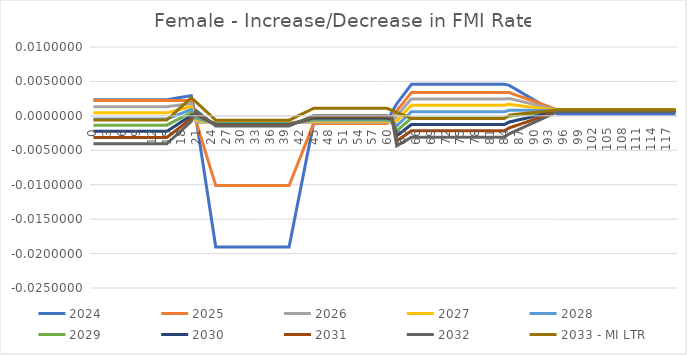
| Category | 2024 | 2025 | 2026 | 2027 | 2028 | 2029 | 2030 | 2031 | 2032 | 2033 - MI LTR |
|---|---|---|---|---|---|---|---|---|---|---|
| 0.0 | 0.002 | 0.002 | 0.001 | 0 | 0 | -0.001 | -0.002 | -0.003 | -0.004 | -0.001 |
| 1.0 | 0.002 | 0.002 | 0.001 | 0 | 0 | -0.001 | -0.002 | -0.003 | -0.004 | -0.001 |
| 2.0 | 0.002 | 0.002 | 0.001 | 0 | 0 | -0.001 | -0.002 | -0.003 | -0.004 | -0.001 |
| 3.0 | 0.002 | 0.002 | 0.001 | 0 | 0 | -0.001 | -0.002 | -0.003 | -0.004 | -0.001 |
| 4.0 | 0.002 | 0.002 | 0.001 | 0 | 0 | -0.001 | -0.002 | -0.003 | -0.004 | -0.001 |
| 5.0 | 0.002 | 0.002 | 0.001 | 0 | 0 | -0.001 | -0.002 | -0.003 | -0.004 | -0.001 |
| 6.0 | 0.002 | 0.002 | 0.001 | 0 | 0 | -0.001 | -0.002 | -0.003 | -0.004 | -0.001 |
| 7.0 | 0.002 | 0.002 | 0.001 | 0 | 0 | -0.001 | -0.002 | -0.003 | -0.004 | -0.001 |
| 8.0 | 0.002 | 0.002 | 0.001 | 0 | 0 | -0.001 | -0.002 | -0.003 | -0.004 | -0.001 |
| 9.0 | 0.002 | 0.002 | 0.001 | 0 | 0 | -0.001 | -0.002 | -0.003 | -0.004 | -0.001 |
| 10.0 | 0.002 | 0.002 | 0.001 | 0 | 0 | -0.001 | -0.002 | -0.003 | -0.004 | -0.001 |
| 11.0 | 0.002 | 0.002 | 0.001 | 0 | 0 | -0.001 | -0.002 | -0.003 | -0.004 | -0.001 |
| 12.0 | 0.002 | 0.002 | 0.001 | 0 | 0 | -0.001 | -0.002 | -0.003 | -0.004 | -0.001 |
| 13.0 | 0.002 | 0.002 | 0.001 | 0 | 0 | -0.001 | -0.002 | -0.003 | -0.004 | -0.001 |
| 14.0 | 0.002 | 0.002 | 0.001 | 0 | 0 | -0.001 | -0.002 | -0.003 | -0.004 | -0.001 |
| 15.0 | 0.002 | 0.002 | 0.001 | 0 | 0 | -0.001 | -0.002 | -0.003 | -0.004 | -0.001 |
| 16.0 | 0.002 | 0.002 | 0.001 | 0.001 | 0 | -0.001 | -0.002 | -0.003 | -0.003 | 0 |
| 17.0 | 0.003 | 0.002 | 0.002 | 0.001 | 0 | -0.001 | -0.001 | -0.002 | -0.003 | 0.001 |
| 18.0 | 0.003 | 0.002 | 0.002 | 0.001 | 0 | 0 | -0.001 | -0.001 | -0.002 | 0.001 |
| 19.0 | 0.003 | 0.002 | 0.002 | 0.001 | 0.001 | 0 | 0 | -0.001 | -0.001 | 0.002 |
| 20.0 | 0.003 | 0.002 | 0.002 | 0.001 | 0.001 | 0 | 0 | 0 | -0.001 | 0.003 |
| 21.0 | -0.001 | -0.001 | -0.001 | -0.001 | 0 | 0 | 0 | 0 | 0.001 | 0.002 |
| 22.0 | -0.005 | -0.003 | -0.001 | -0.001 | -0.001 | 0 | 0 | 0 | 0 | 0.001 |
| 23.0 | -0.01 | -0.005 | -0.001 | -0.001 | -0.001 | -0.001 | -0.001 | 0 | 0 | 0.001 |
| 24.0 | -0.014 | -0.008 | -0.001 | -0.001 | -0.001 | -0.001 | -0.001 | -0.001 | -0.001 | 0 |
| 25.0 | -0.019 | -0.01 | -0.001 | -0.001 | -0.001 | -0.001 | -0.001 | -0.001 | -0.001 | -0.001 |
| 26.0 | -0.019 | -0.01 | -0.001 | -0.001 | -0.001 | -0.001 | -0.001 | -0.001 | -0.001 | -0.001 |
| 27.0 | -0.019 | -0.01 | -0.001 | -0.001 | -0.001 | -0.001 | -0.001 | -0.001 | -0.001 | -0.001 |
| 28.0 | -0.019 | -0.01 | -0.001 | -0.001 | -0.001 | -0.001 | -0.001 | -0.001 | -0.001 | -0.001 |
| 29.0 | -0.019 | -0.01 | -0.001 | -0.001 | -0.001 | -0.001 | -0.001 | -0.001 | -0.001 | -0.001 |
| 30.0 | -0.019 | -0.01 | -0.001 | -0.001 | -0.001 | -0.001 | -0.001 | -0.001 | -0.001 | -0.001 |
| 31.0 | -0.019 | -0.01 | -0.001 | -0.001 | -0.001 | -0.001 | -0.001 | -0.001 | -0.001 | -0.001 |
| 32.0 | -0.019 | -0.01 | -0.001 | -0.001 | -0.001 | -0.001 | -0.001 | -0.001 | -0.001 | -0.001 |
| 33.0 | -0.019 | -0.01 | -0.001 | -0.001 | -0.001 | -0.001 | -0.001 | -0.001 | -0.001 | -0.001 |
| 34.0 | -0.019 | -0.01 | -0.001 | -0.001 | -0.001 | -0.001 | -0.001 | -0.001 | -0.001 | -0.001 |
| 35.0 | -0.019 | -0.01 | -0.001 | -0.001 | -0.001 | -0.001 | -0.001 | -0.001 | -0.001 | -0.001 |
| 36.0 | -0.019 | -0.01 | -0.001 | -0.001 | -0.001 | -0.001 | -0.001 | -0.001 | -0.001 | -0.001 |
| 37.0 | -0.019 | -0.01 | -0.001 | -0.001 | -0.001 | -0.001 | -0.001 | -0.001 | -0.001 | -0.001 |
| 38.0 | -0.019 | -0.01 | -0.001 | -0.001 | -0.001 | -0.001 | -0.001 | -0.001 | -0.001 | -0.001 |
| 39.0 | -0.019 | -0.01 | -0.001 | -0.001 | -0.001 | -0.001 | -0.001 | -0.001 | -0.001 | -0.001 |
| 40.0 | -0.019 | -0.01 | -0.001 | -0.001 | -0.001 | -0.001 | -0.001 | -0.001 | -0.001 | -0.001 |
| 41.0 | -0.015 | -0.008 | -0.001 | -0.001 | -0.001 | -0.001 | -0.001 | -0.001 | -0.001 | 0 |
| 42.0 | -0.012 | -0.007 | -0.001 | -0.001 | -0.001 | -0.001 | -0.001 | -0.001 | -0.001 | 0 |
| 43.0 | -0.008 | -0.005 | -0.001 | -0.001 | -0.001 | -0.001 | -0.001 | -0.001 | -0.001 | 0 |
| 44.0 | -0.005 | -0.003 | -0.001 | -0.001 | -0.001 | -0.001 | 0 | 0 | 0 | 0.001 |
| 45.0 | -0.001 | -0.001 | -0.001 | -0.001 | -0.001 | 0 | 0 | 0 | 0 | 0.001 |
| 46.0 | -0.001 | -0.001 | -0.001 | -0.001 | -0.001 | 0 | 0 | 0 | 0 | 0.001 |
| 47.0 | -0.001 | -0.001 | -0.001 | -0.001 | -0.001 | 0 | 0 | 0 | 0 | 0.001 |
| 48.0 | -0.001 | -0.001 | -0.001 | -0.001 | -0.001 | 0 | 0 | 0 | 0 | 0.001 |
| 49.0 | -0.001 | -0.001 | -0.001 | -0.001 | -0.001 | 0 | 0 | 0 | 0 | 0.001 |
| 50.0 | -0.001 | -0.001 | -0.001 | -0.001 | -0.001 | 0 | 0 | 0 | 0 | 0.001 |
| 51.0 | -0.001 | -0.001 | -0.001 | -0.001 | -0.001 | 0 | 0 | 0 | 0 | 0.001 |
| 52.0 | -0.001 | -0.001 | -0.001 | -0.001 | -0.001 | 0 | 0 | 0 | 0 | 0.001 |
| 53.0 | -0.001 | -0.001 | -0.001 | -0.001 | -0.001 | 0 | 0 | 0 | 0 | 0.001 |
| 54.0 | -0.001 | -0.001 | -0.001 | -0.001 | -0.001 | 0 | 0 | 0 | 0 | 0.001 |
| 55.0 | -0.001 | -0.001 | -0.001 | -0.001 | -0.001 | 0 | 0 | 0 | 0 | 0.001 |
| 56.0 | -0.001 | -0.001 | -0.001 | -0.001 | -0.001 | 0 | 0 | 0 | 0 | 0.001 |
| 57.0 | -0.001 | -0.001 | -0.001 | -0.001 | -0.001 | 0 | 0 | 0 | 0 | 0.001 |
| 58.0 | -0.001 | -0.001 | -0.001 | -0.001 | -0.001 | 0 | 0 | 0 | 0 | 0.001 |
| 59.0 | -0.001 | -0.001 | -0.001 | -0.001 | -0.001 | 0 | 0 | 0 | 0 | 0.001 |
| 60.0 | -0.001 | -0.001 | -0.001 | -0.001 | -0.001 | 0 | 0 | 0 | 0 | 0.001 |
| 61.0 | 0.001 | 0 | -0.001 | -0.001 | -0.001 | -0.001 | 0 | 0 | 0 | 0.001 |
| 62.0 | 0.002 | 0.001 | 0 | -0.001 | -0.001 | -0.002 | -0.003 | -0.004 | -0.004 | 0 |
| 63.0 | 0.003 | 0.002 | 0.001 | 0 | -0.001 | -0.002 | -0.002 | -0.003 | -0.004 | 0 |
| 64.0 | 0.004 | 0.003 | 0.002 | 0.001 | 0 | -0.001 | -0.002 | -0.003 | -0.004 | 0 |
| 65.0 | 0.005 | 0.003 | 0.002 | 0.002 | 0.001 | 0 | -0.001 | -0.002 | -0.003 | 0 |
| 66.0 | 0.005 | 0.003 | 0.002 | 0.002 | 0.001 | 0 | -0.001 | -0.002 | -0.003 | 0 |
| 67.0 | 0.005 | 0.003 | 0.002 | 0.002 | 0.001 | 0 | -0.001 | -0.002 | -0.003 | 0 |
| 68.0 | 0.005 | 0.003 | 0.002 | 0.002 | 0.001 | 0 | -0.001 | -0.002 | -0.003 | 0 |
| 69.0 | 0.005 | 0.003 | 0.002 | 0.002 | 0.001 | 0 | -0.001 | -0.002 | -0.003 | 0 |
| 70.0 | 0.005 | 0.003 | 0.002 | 0.002 | 0.001 | 0 | -0.001 | -0.002 | -0.003 | 0 |
| 71.0 | 0.005 | 0.003 | 0.002 | 0.002 | 0.001 | 0 | -0.001 | -0.002 | -0.003 | 0 |
| 72.0 | 0.005 | 0.003 | 0.002 | 0.002 | 0.001 | 0 | -0.001 | -0.002 | -0.003 | 0 |
| 73.0 | 0.005 | 0.003 | 0.002 | 0.002 | 0.001 | 0 | -0.001 | -0.002 | -0.003 | 0 |
| 74.0 | 0.005 | 0.003 | 0.002 | 0.002 | 0.001 | 0 | -0.001 | -0.002 | -0.003 | 0 |
| 75.0 | 0.005 | 0.003 | 0.002 | 0.002 | 0.001 | 0 | -0.001 | -0.002 | -0.003 | 0 |
| 76.0 | 0.005 | 0.003 | 0.002 | 0.002 | 0.001 | 0 | -0.001 | -0.002 | -0.003 | 0 |
| 77.0 | 0.005 | 0.003 | 0.002 | 0.002 | 0.001 | 0 | -0.001 | -0.002 | -0.003 | 0 |
| 78.0 | 0.005 | 0.003 | 0.002 | 0.002 | 0.001 | 0 | -0.001 | -0.002 | -0.003 | 0 |
| 79.0 | 0.005 | 0.003 | 0.002 | 0.002 | 0.001 | 0 | -0.001 | -0.002 | -0.003 | 0 |
| 80.0 | 0.005 | 0.003 | 0.002 | 0.002 | 0.001 | 0 | -0.001 | -0.002 | -0.003 | 0 |
| 81.0 | 0.005 | 0.003 | 0.002 | 0.002 | 0.001 | 0 | -0.001 | -0.002 | -0.003 | 0 |
| 82.0 | 0.005 | 0.003 | 0.002 | 0.002 | 0.001 | 0 | -0.001 | -0.002 | -0.003 | 0 |
| 83.0 | 0.005 | 0.003 | 0.002 | 0.002 | 0.001 | 0 | -0.001 | -0.002 | -0.003 | 0 |
| 84.0 | 0.005 | 0.003 | 0.002 | 0.002 | 0.001 | 0 | -0.001 | -0.002 | -0.003 | 0 |
| 85.0 | 0.004 | 0.003 | 0.003 | 0.002 | 0.001 | 0 | -0.001 | -0.002 | -0.003 | 0 |
| 86.0 | 0.004 | 0.003 | 0.002 | 0.002 | 0.001 | 0 | -0.001 | -0.002 | -0.002 | 0 |
| 87.0 | 0.004 | 0.003 | 0.002 | 0.001 | 0.001 | 0 | -0.001 | -0.001 | -0.002 | 0 |
| 88.0 | 0.003 | 0.003 | 0.002 | 0.001 | 0.001 | 0 | 0 | -0.001 | -0.002 | 0 |
| 89.0 | 0.003 | 0.002 | 0.002 | 0.001 | 0.001 | 0 | 0 | -0.001 | -0.001 | 0 |
| 90.0 | 0.002 | 0.002 | 0.002 | 0.001 | 0.001 | 0 | 0 | -0.001 | -0.001 | 0 |
| 91.0 | 0.002 | 0.002 | 0.002 | 0.001 | 0.001 | 0 | 0 | 0 | -0.001 | 0.001 |
| 92.0 | 0.002 | 0.002 | 0.001 | 0.001 | 0.001 | 0.001 | 0 | 0 | 0 | 0.001 |
| 93.0 | 0.001 | 0.001 | 0.001 | 0.001 | 0.001 | 0.001 | 0 | 0 | 0 | 0.001 |
| 94.0 | 0.001 | 0.001 | 0.001 | 0.001 | 0.001 | 0.001 | 0.001 | 0 | 0 | 0.001 |
| 95.0 | 0 | 0.001 | 0.001 | 0.001 | 0.001 | 0.001 | 0.001 | 0.001 | 0.001 | 0.001 |
| 96.0 | 0 | 0.001 | 0.001 | 0.001 | 0.001 | 0.001 | 0.001 | 0.001 | 0.001 | 0.001 |
| 97.0 | 0 | 0.001 | 0.001 | 0.001 | 0.001 | 0.001 | 0.001 | 0.001 | 0.001 | 0.001 |
| 98.0 | 0 | 0.001 | 0.001 | 0.001 | 0.001 | 0.001 | 0.001 | 0.001 | 0.001 | 0.001 |
| 99.0 | 0 | 0.001 | 0.001 | 0.001 | 0.001 | 0.001 | 0.001 | 0.001 | 0.001 | 0.001 |
| 100.0 | 0 | 0.001 | 0.001 | 0.001 | 0.001 | 0.001 | 0.001 | 0.001 | 0.001 | 0.001 |
| 101.0 | 0 | 0.001 | 0.001 | 0.001 | 0.001 | 0.001 | 0.001 | 0.001 | 0.001 | 0.001 |
| 102.0 | 0 | 0.001 | 0.001 | 0.001 | 0.001 | 0.001 | 0.001 | 0.001 | 0.001 | 0.001 |
| 103.0 | 0 | 0.001 | 0.001 | 0.001 | 0.001 | 0.001 | 0.001 | 0.001 | 0.001 | 0.001 |
| 104.0 | 0 | 0.001 | 0.001 | 0.001 | 0.001 | 0.001 | 0.001 | 0.001 | 0.001 | 0.001 |
| 105.0 | 0 | 0.001 | 0.001 | 0.001 | 0.001 | 0.001 | 0.001 | 0.001 | 0.001 | 0.001 |
| 106.0 | 0 | 0.001 | 0.001 | 0.001 | 0.001 | 0.001 | 0.001 | 0.001 | 0.001 | 0.001 |
| 107.0 | 0 | 0.001 | 0.001 | 0.001 | 0.001 | 0.001 | 0.001 | 0.001 | 0.001 | 0.001 |
| 108.0 | 0 | 0.001 | 0.001 | 0.001 | 0.001 | 0.001 | 0.001 | 0.001 | 0.001 | 0.001 |
| 109.0 | 0 | 0.001 | 0.001 | 0.001 | 0.001 | 0.001 | 0.001 | 0.001 | 0.001 | 0.001 |
| 110.0 | 0 | 0.001 | 0.001 | 0.001 | 0.001 | 0.001 | 0.001 | 0.001 | 0.001 | 0.001 |
| 111.0 | 0 | 0.001 | 0.001 | 0.001 | 0.001 | 0.001 | 0.001 | 0.001 | 0.001 | 0.001 |
| 112.0 | 0 | 0.001 | 0.001 | 0.001 | 0.001 | 0.001 | 0.001 | 0.001 | 0.001 | 0.001 |
| 113.0 | 0 | 0.001 | 0.001 | 0.001 | 0.001 | 0.001 | 0.001 | 0.001 | 0.001 | 0.001 |
| 114.0 | 0 | 0.001 | 0.001 | 0.001 | 0.001 | 0.001 | 0.001 | 0.001 | 0.001 | 0.001 |
| 115.0 | 0 | 0.001 | 0.001 | 0.001 | 0.001 | 0.001 | 0.001 | 0.001 | 0.001 | 0.001 |
| 116.0 | 0 | 0.001 | 0.001 | 0.001 | 0.001 | 0.001 | 0.001 | 0.001 | 0.001 | 0.001 |
| 117.0 | 0 | 0.001 | 0.001 | 0.001 | 0.001 | 0.001 | 0.001 | 0.001 | 0.001 | 0.001 |
| 118.0 | 0 | 0.001 | 0.001 | 0.001 | 0.001 | 0.001 | 0.001 | 0.001 | 0.001 | 0.001 |
| 119.0 | 0 | 0.001 | 0.001 | 0.001 | 0.001 | 0.001 | 0.001 | 0.001 | 0.001 | 0.001 |